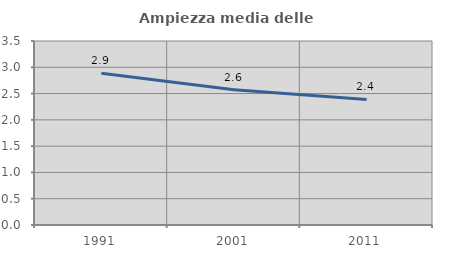
| Category | Ampiezza media delle famiglie |
|---|---|
| 1991.0 | 2.885 |
| 2001.0 | 2.573 |
| 2011.0 | 2.388 |